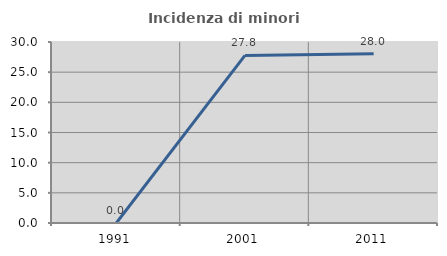
| Category | Incidenza di minori stranieri |
|---|---|
| 1991.0 | 0 |
| 2001.0 | 27.778 |
| 2011.0 | 28.049 |